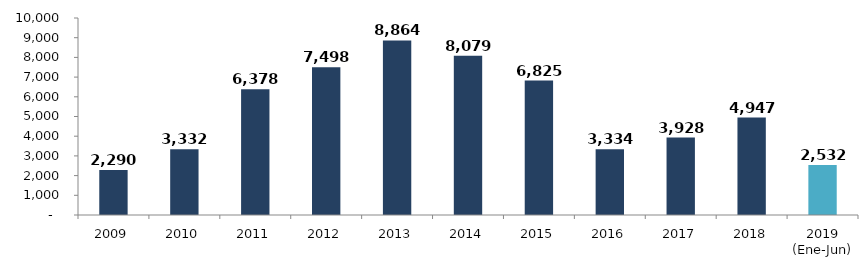
| Category | Series 0 |
|---|---|
| 2009 | 2290.273 |
| 2010 | 3331.554 |
| 2011 | 6377.615 |
| 2012 | 7498.207 |
| 2013 | 8863.622 |
| 2014 | 8079.21 |
| 2015 | 6824.624 |
| 2016 | 3333.564 |
| 2017 | 3928.017 |
| 2018 | 4947.435 |
| 2019 (Ene-Jun) | 2532.354 |